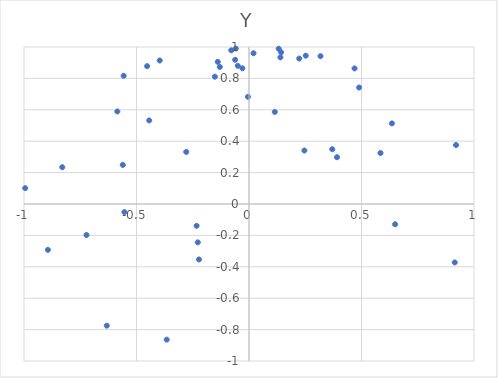
| Category | Y |
|---|---|
| -0.061700147701592406 | 0.918 |
| 0.13208053102014908 | 0.989 |
| -0.8937586569862268 | -0.292 |
| -0.39683402720898525 | 0.914 |
| -0.12968560850054311 | 0.873 |
| 0.36995574657505115 | 0.349 |
| -0.4528458822562705 | 0.878 |
| 0.11472925613459092 | 0.586 |
| -0.15170620263957046 | 0.811 |
| -0.4434398739820267 | 0.532 |
| -0.5539602053061807 | -0.051 |
| -0.2328437040289142 | -0.139 |
| -0.05885160861959474 | 0.991 |
| -0.04974800388300101 | 0.88 |
| 0.25229171990813004 | 0.945 |
| 0.6350979326563767 | 0.513 |
| 0.13958771516952123 | 0.934 |
| -0.13875326627555656 | 0.905 |
| -0.5851435484252927 | 0.589 |
| 0.6493978288024546 | -0.129 |
| 0.39102268264442336 | 0.298 |
| 0.48937992394905677 | 0.742 |
| 0.4691044577574859 | 0.864 |
| 0.9202792111055884 | 0.376 |
| 0.14267524433200587 | 0.966 |
| -0.7221890387268545 | -0.197 |
| -0.6320254521260524 | -0.775 |
| 0.5843843458051341 | 0.325 |
| -0.029351501226282144 | 0.864 |
| 0.22326478252022214 | 0.926 |
| 0.020209881281546653 | 0.96 |
| -0.27895668872871865 | 0.332 |
| -0.0787520324936058 | 0.979 |
| -0.004616428844038308 | 0.683 |
| 0.9144144474590212 | -0.372 |
| 0.24612236584940886 | 0.341 |
| -0.22762595563805646 | -0.244 |
| -0.22232125371762046 | -0.353 |
| -0.560779176098749 | 0.249 |
| -0.9947579728646962 | 0.101 |
| -0.8299483838886964 | 0.234 |
| -0.3658267783191655 | -0.864 |
| -0.5570420544322404 | 0.817 |
| 0.3177621096003894 | 0.941 |